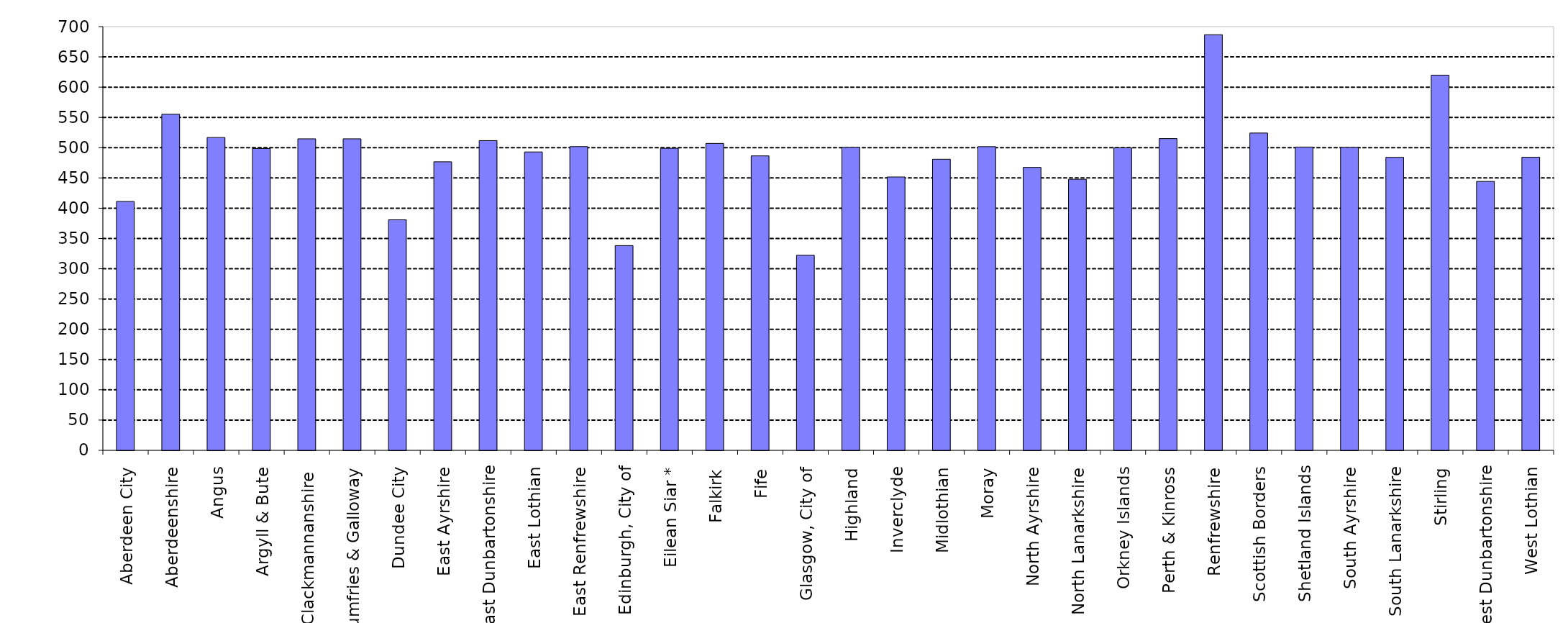
| Category | Series 0 |
|---|---|
| Aberdeen City | 411.128 |
| Aberdeenshire | 555.25 |
| Angus | 516.802 |
| Argyll & Bute | 498.666 |
| Clackmannanshire  | 514.642 |
| Dumfries & Galloway | 514.66 |
| Dundee City | 380.809 |
| East Ayrshire | 476.686 |
| East Dunbartonshire | 511.687 |
| East Lothian | 492.966 |
| East Renfrewshire | 501.801 |
| Edinburgh, City of | 338.272 |
| Eilean Siar * | 499.019 |
| Falkirk | 507.057 |
| Fife | 486.473 |
| Glasgow, City of | 322.239 |
| Highland | 500.607 |
| Inverclyde | 451.609 |
| Midlothian | 480.955 |
| Moray | 501.714 |
| North Ayrshire | 467.479 |
| North Lanarkshire | 447.889 |
| Orkney Islands | 499.821 |
| Perth & Kinross | 515.068 |
| Renfrewshire | 686.666 |
| Scottish Borders | 524.236 |
| Shetland Islands | 501.049 |
| South Ayrshire | 500.58 |
| South Lanarkshire | 484.05 |
| Stirling | 619.866 |
| West Dunbartonshire | 444.272 |
| West Lothian | 484.256 |